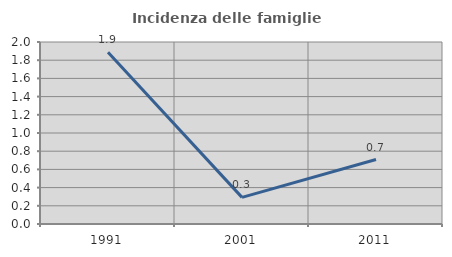
| Category | Incidenza delle famiglie numerose |
|---|---|
| 1991.0 | 1.887 |
| 2001.0 | 0.292 |
| 2011.0 | 0.708 |